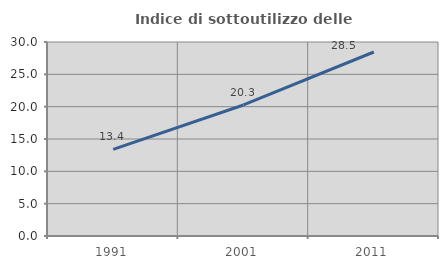
| Category | Indice di sottoutilizzo delle abitazioni  |
|---|---|
| 1991.0 | 13.384 |
| 2001.0 | 20.264 |
| 2011.0 | 28.451 |